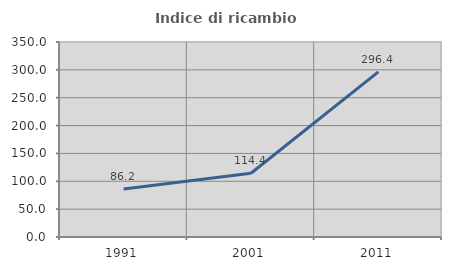
| Category | Indice di ricambio occupazionale  |
|---|---|
| 1991.0 | 86.165 |
| 2001.0 | 114.426 |
| 2011.0 | 296.429 |